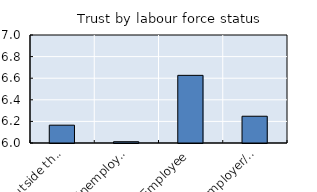
| Category | Self-reported trust in others |
|---|---|
| Outside the labour force | 6.165 |
| Unemployed | 6.012 |
| Employee | 6.626 |
| Employer/self-employed | 6.248 |